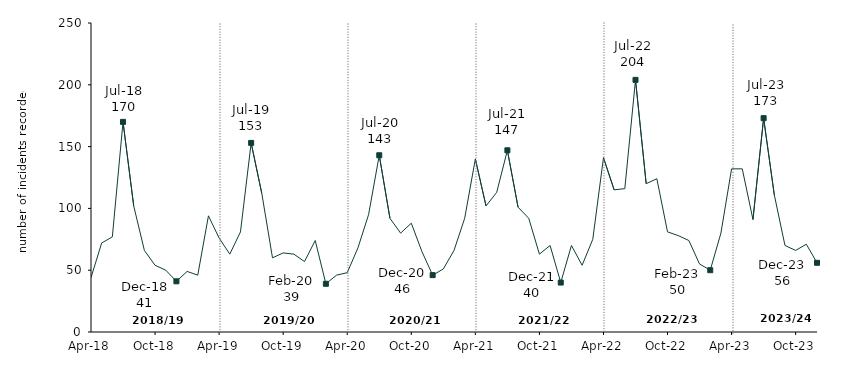
| Category | Series 0 |
|---|---|
| 2018-04-01 | 44 |
| 2018-05-01 | 72 |
| 2018-06-01 | 77 |
| 2018-07-01 | 170 |
| 2018-08-01 | 102 |
| 2018-09-01 | 66 |
| 2018-10-01 | 54 |
| 2018-11-01 | 50 |
| 2018-12-01 | 41 |
| 2019-01-01 | 49 |
| 2019-02-01 | 46 |
| 2019-03-01 | 94 |
| 2019-04-01 | 76 |
| 2019-05-01 | 63 |
| 2019-06-01 | 81 |
| 2019-07-01 | 153 |
| 2019-08-01 | 112 |
| 2019-09-01 | 60 |
| 2019-10-01 | 64 |
| 2019-11-01 | 63 |
| 2019-12-01 | 57 |
| 2020-01-01 | 74 |
| 2020-02-01 | 39 |
| 2020-03-01 | 46 |
| 2020-04-01 | 48 |
| 2020-05-01 | 68 |
| 2020-06-01 | 95 |
| 2020-07-01 | 143 |
| 2020-08-01 | 92 |
| 2020-09-01 | 80 |
| 2020-10-01 | 88 |
| 2020-11-01 | 65 |
| 2020-12-01 | 46 |
| 2021-01-01 | 51 |
| 2021-02-01 | 66 |
| 2021-03-01 | 92 |
| 2021-04-01 | 140 |
| 2021-05-01 | 102 |
| 2021-06-01 | 113 |
| 2021-07-01 | 147 |
| 2021-08-01 | 101 |
| 2021-09-01 | 92 |
| 2021-10-01 | 63 |
| 2021-11-01 | 70 |
| 2021-12-01 | 40 |
| 2022-01-01 | 70 |
| 2022-02-01 | 54 |
| 2022-03-01 | 75 |
| 2022-04-01 | 141 |
| 2022-05-01 | 115 |
| 2022-06-01 | 116 |
| 2022-07-01 | 204 |
| 2022-08-01 | 120 |
| 2022-09-01 | 124 |
| 2022-10-01 | 81 |
| 2022-11-01 | 78 |
| 2022-12-01 | 74 |
| 2023-01-01 | 55 |
| 2023-02-01 | 50 |
| 2023-03-01 | 80 |
| 2023-04-01 | 132 |
| 2023-05-01 | 132 |
| 2023-06-01 | 91 |
| 2023-07-01 | 173 |
| 2023-08-01 | 111 |
| 2023-09-01 | 70 |
| 2023-10-01 | 66 |
| 2023-11-01 | 71 |
| 2023-12-01 | 56 |